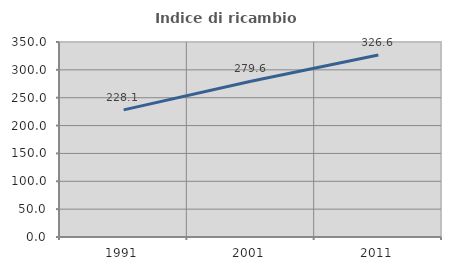
| Category | Indice di ricambio occupazionale  |
|---|---|
| 1991.0 | 228.125 |
| 2001.0 | 279.63 |
| 2011.0 | 326.562 |